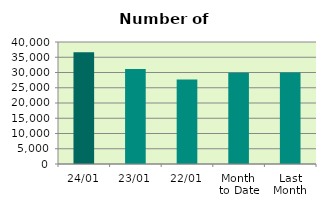
| Category | Series 0 |
|---|---|
| 24/01 | 36646 |
| 23/01 | 31164 |
| 22/01 | 27676 |
| Month 
to Date | 29927.412 |
| Last
Month | 29998.632 |